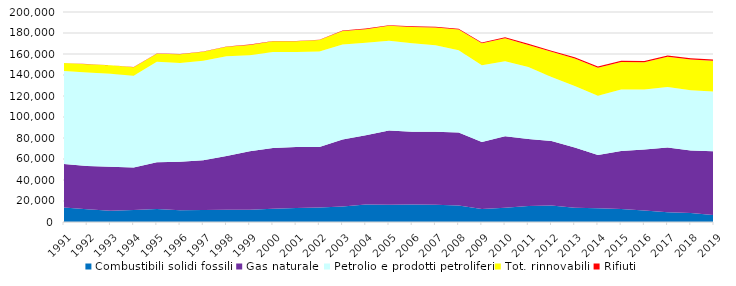
| Category | Combustibili solidi fossili | Gas naturale | Petrolio e prodotti petroliferi | Tot. rinnovabili | Rifiuti    |
|---|---|---|---|---|---|
| 1991 | 13796.939 | 41475 | 88554.64 | 7510.562 | 141.134 |
| 1992 | 12191.199 | 41112.167 | 89096.206 | 7921.601 | 113.452 |
| 1993 | 10656.065 | 41949.871 | 88645.746 | 7975.399 | 107.982 |
| 1994 | 11363.9 | 40536.866 | 87342.077 | 8253.836 | 109.439 |
| 1995 | 12280.498 | 44652.343 | 95580.077 | 7719.246 | 162.105 |
| 1996 | 11241.485 | 46066.81 | 94132.325 | 8354.839 | 171.969 |
| 1997 | 11344.122 | 47485.834 | 94625.893 | 8654.667 | 191.077 |
| 1998 | 11785.087 | 51126.247 | 94870.854 | 9043.427 | 241.473 |
| 1999 | 11770.298 | 55568.723 | 91502.765 | 9773.407 | 346.756 |
| 2000 | 12560.073 | 57940.284 | 91500.472 | 10112.826 | 258.527 |
| 2001 | 13359.992 | 58099.205 | 90385.925 | 10341.081 | 293.398 |
| 2002 | 13729.932 | 57706.126 | 91057.794 | 10889.378 | 295.381 |
| 2003 | 14875.923 | 63620.959 | 90538.601 | 12909.269 | 476.211 |
| 2004 | 16595.742 | 66018.981 | 88000.343 | 12963.412 | 656.086 |
| 2005 | 16468.92 | 70651.247 | 85560.319 | 14106.718 | 672.757 |
| 2006 | 16673.366 | 69191.81 | 84460.21 | 15326.492 | 766.003 |
| 2007 | 16327.822 | 69530.868 | 82401.354 | 16945.996 | 825.714 |
| 2008 | 15798.414 | 69519.411 | 78329.869 | 19707.179 | 751.959 |
| 2009 | 12368.336 | 63901.913 | 72958.592 | 21026.557 | 802.379 |
| 2010 | 13673.981 | 68056.664 | 71386.109 | 21864.302 | 1041.058 |
| 2011 | 15331.374 | 63814.144 | 68449.607 | 21025.853 | 1135.139 |
| 2012 | 15714.641 | 61355.61 | 61114.669 | 23884.74 | 1132.273 |
| 2013 | 13536.181 | 57386.715 | 58515.656 | 26370.626 | 1137.981 |
| 2014 | 13058.829 | 50706.083 | 56564.777 | 26512.291 | 1157.758 |
| 2015 | 12299.68 | 55301.505 | 58622.661 | 26268.705 | 1149.207 |
| 2016 | 10983.003 | 58079.579 | 57042.958 | 26017.921 | 1183.123 |
| 2017 | 9341.797 | 61549.023 | 57722.322 | 28821.095 | 1134.201 |
| 2018 | 8538.161 | 59513.398 | 57470.009 | 29281.72 | 1132.984 |
| 2019 | 6480.37 | 60949.061 | 56682.993 | 29512.128 | 1182.331 |